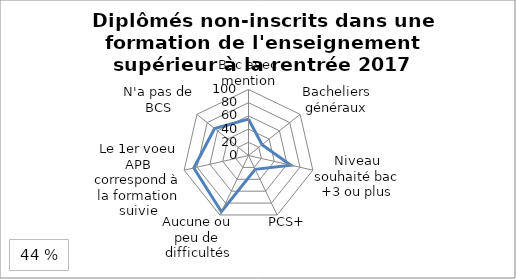
| Category | Diplômés non inscrits dans une formation de l'enseignement supérieur à la rentrée 2017 |
|---|---|
| Bac avec mention | 55.1 |
| Bacheliers généraux | 26.3 |
| Niveau souhaité bac +3 ou plus | 65.8 |
| PCS+ | 23.2 |
| Aucune ou peu de difficultés | 94.6 |
| Le 1er voeu APB correspond à la formation suivie | 85 |
| N'a pas de BCS | 65.7 |